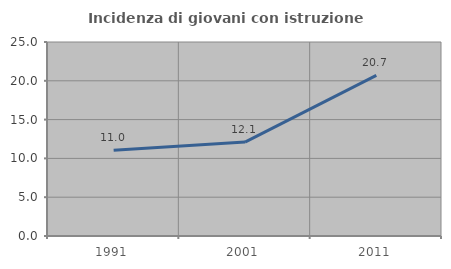
| Category | Incidenza di giovani con istruzione universitaria |
|---|---|
| 1991.0 | 11.047 |
| 2001.0 | 12.105 |
| 2011.0 | 20.69 |